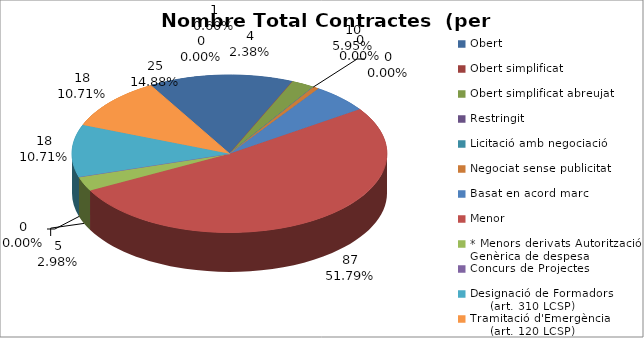
| Category | Nombre Total Contractes |
|---|---|
| Obert | 25 |
| Obert simplificat | 0 |
| Obert simplificat abreujat | 4 |
| Restringit | 0 |
| Licitació amb negociació | 0 |
| Negociat sense publicitat | 1 |
| Basat en acord marc | 10 |
| Menor | 87 |
| * Menors derivats Autorització Genèrica de despesa | 5 |
| Concurs de Projectes | 0 |
| Designació de Formadors
     (art. 310 LCSP) | 18 |
| Tramitació d'Emergència
     (art. 120 LCSP) | 18 |